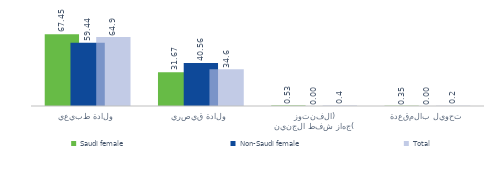
| Category | Saudi female  | Non-Saudi female | Total |
|---|---|---|---|
| ولادة طبيعية | 67.449 | 59.442 | 64.856 |
| ولادة قيصرية | 31.673 | 40.558 | 34.55 |
| الفنتوز (جهاز شفط الجنين) | 0.527 | 0 | 0.357 |
| تحويل بالمقعدة | 0.351 | 0 | 0.237 |